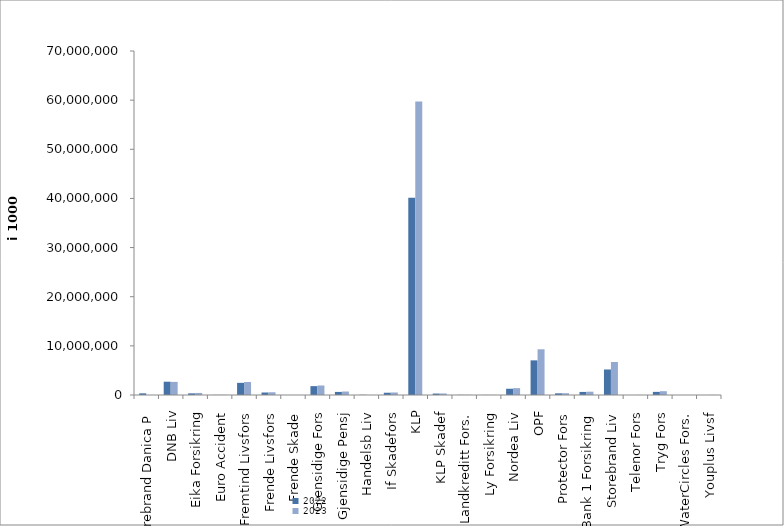
| Category | 2022 | 2023 |
|---|---|---|
| Storebrand Danica P | 337291.249 | 0 |
| DNB Liv | 2702411 | 2668490 |
| Eika Forsikring | 335934 | 419288 |
| Euro Accident | 26920 | 42908 |
| Fremtind Livsfors | 2472117.632 | 2646203.673 |
| Frende Livsfors | 507793 | 558666 |
| Frende Skade | 6370.085 | 6433.6 |
| Gjensidige Fors | 1802206.75 | 1932975.664 |
| Gjensidige Pensj | 625492 | 709364 |
| Handelsb Liv | 37716.661 | 0 |
| If Skadefors | 461957.495 | 512230.042 |
| KLP | 40116042.617 | 59728575.082 |
| KLP Skadef | 293311.632 | 312830.961 |
| Landkreditt Fors. | 28431 | 29620 |
| Ly Forsikring | 16353.946 | 21105.621 |
| Nordea Liv | 1272563.135 | 1396771.933 |
| OPF | 7048000 | 9303000 |
| Protector Fors | 338102.514 | 364919.812 |
| SpareBank 1 Forsikring | 621880.973 | 672776.472 |
| Storebrand Liv | 5192979.767 | 6718868.076 |
| Telenor Fors | 0 | 10042 |
| Tryg Fors | 636479 | 773050 |
| WaterCircles Fors. | 2123 | 1778.37 |
| Youplus Livsf | 3579 | 16904 |